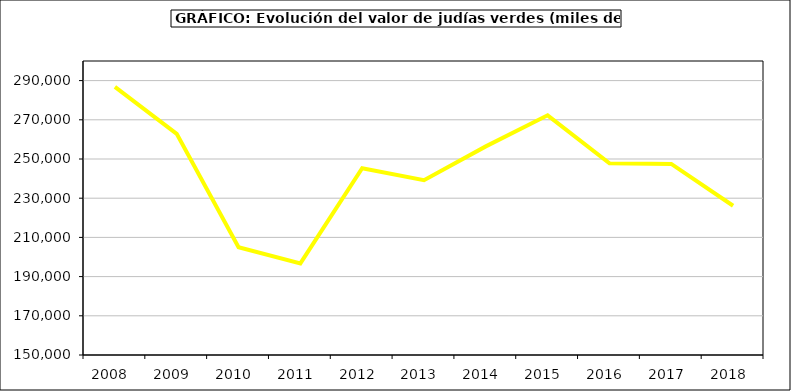
| Category | Valor |
|---|---|
| 2008.0 | 286762.816 |
| 2009.0 | 262825.282 |
| 2010.0 | 205008.431 |
| 2011.0 | 196749.281 |
| 2012.0 | 245279.866 |
| 2013.0 | 239211.036 |
| 2014.0 | 256441.694 |
| 2015.0 | 272296 |
| 2016.0 | 247800 |
| 2017.0 | 247502.748 |
| 2018.0 | 226142.115 |